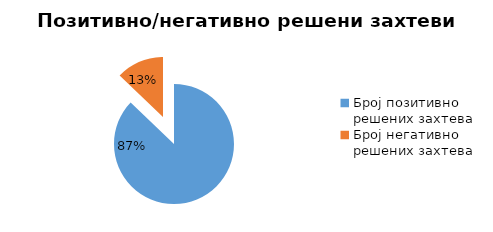
| Category | Series 0 |
|---|---|
| Број позитивно решених захтева | 49070 |
| Број негативно решених захтева | 7242 |